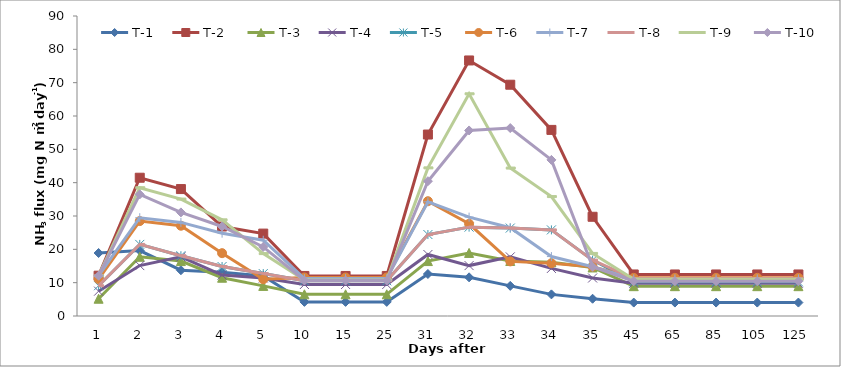
| Category | T-1 | T-2  | T-3 | T-4 | T-5  | T-6 | T-7 | T-8 | T-9  | T-10  |
|---|---|---|---|---|---|---|---|---|---|---|
| 1.0 | 18.9 | 12.09 | 5.18 | 7.45 | 9.09 | 11.09 | 12.09 | 9.09 | 12.09 | 12.09 |
| 2.0 | 19.625 | 41.48 | 17.77 | 15.125 | 21.48 | 28.48 | 29.48 | 21.48 | 38.48 | 36.48 |
| 3.0 | 13.733 | 38.08 | 16.48 | 17.733 | 18.08 | 27.08 | 28.08 | 18.08 | 35.08 | 31.08 |
| 4.0 | 13.15 | 26.85 | 11.48 | 12.275 | 14.85 | 18.85 | 24.85 | 14.85 | 28.85 | 26.85 |
| 5.0 | 12.03 | 24.72 | 9.03 | 11.4 | 12.72 | 11.02 | 22.72 | 12.72 | 18.72 | 20.72 |
| 10.0 | 4.23 | 12.01 | 6.51 | 9.458 | 10.56 | 11.56 | 11.22 | 10.56 | 10.81 | 10.65 |
| 15.0 | 4.23 | 12.01 | 6.51 | 9.458 | 10.56 | 11.56 | 11.22 | 10.56 | 10.81 | 10.65 |
| 25.0 | 4.23 | 12.01 | 6.51 | 9.458 | 10.56 | 11.56 | 11.22 | 10.56 | 10.81 | 10.65 |
| 31.0 | 12.6 | 54.44 | 16.48 | 18.45 | 24.44 | 34.44 | 34.25 | 24.44 | 44.44 | 40.44 |
| 32.0 | 11.6 | 76.66 | 18.92 | 15.125 | 26.66 | 27.66 | 29.66 | 26.66 | 66.66 | 55.66 |
| 33.0 | 9.033 | 69.38 | 16.5 | 17.733 | 26.38 | 16.38 | 26.48 | 26.38 | 44.38 | 56.38 |
| 34.0 | 6.488 | 55.83 | 16.138 | 14.275 | 25.83 | 15.83 | 17.83 | 25.83 | 35.83 | 46.83 |
| 35.0 | 5.176 | 29.77 | 14.56 | 11.4 | 16.77 | 14.77 | 14.77 | 16.77 | 18.77 | 14.77 |
| 45.0 | 4.03 | 12.46 | 8.95 | 9.81 | 10.24 | 11.44 | 11.14 | 11.24 | 11.024 | 10.44 |
| 65.0 | 4.03 | 12.46 | 8.95 | 9.81 | 10.24 | 11.44 | 11.14 | 11.24 | 11.024 | 10.44 |
| 85.0 | 4.03 | 12.46 | 8.95 | 9.81 | 10.24 | 11.44 | 11.14 | 11.24 | 11.024 | 10.44 |
| 105.0 | 4.03 | 12.46 | 8.95 | 9.81 | 10.24 | 11.44 | 11.14 | 11.24 | 11.024 | 10.44 |
| 125.0 | 4.03 | 12.46 | 8.95 | 9.81 | 10.24 | 11.44 | 11.14 | 11.24 | 11.024 | 10.44 |